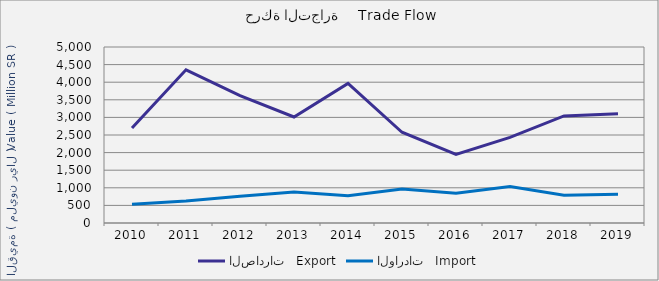
| Category | الصادرات   Export | الواردات   Import |
|---|---|---|
| 2010.0 | 2698586719 | 529612688 |
| 2011.0 | 4352573798 | 624388250 |
| 2012.0 | 3615981267 | 760554267 |
| 2013.0 | 3011155751 | 882397873 |
| 2014.0 | 3964685861 | 774293930 |
| 2015.0 | 2577797022 | 965141215 |
| 2016.0 | 1947552989 | 844459515 |
| 2017.0 | 2430535604 | 1036398660 |
| 2018.0 | 3042789705 | 791540263 |
| 2019.0 | 3104260057 | 813565521 |